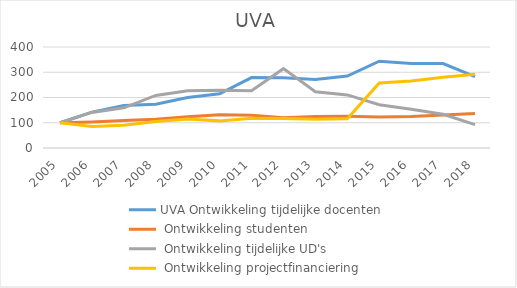
| Category | UVA Ontwikkeling tijdelijke docenten | UVA Ontwikkeling studenten | UVA Ontwikkeling tijdelijke UD's | UVA Ontwikkeling projectfinanciering |
|---|---|---|---|---|
| 2005.0 | 100 | 100 | 100 | 100 |
| 2006.0 | 142.105 | 103.16 | 140.816 | 85.627 |
| 2007.0 | 168.421 | 108.665 | 159.184 | 90.049 |
| 2008.0 | 173.684 | 113.745 | 208.163 | 105.143 |
| 2009.0 | 200 | 123.912 | 226.531 | 114.899 |
| 2010.0 | 214.912 | 131.898 | 228.571 | 107.439 |
| 2011.0 | 278.947 | 129.224 | 226.531 | 117.684 |
| 2012.0 | 278.07 | 119.647 | 314.286 | 116.339 |
| 2013.0 | 271.053 | 125.112 | 222.449 | 113.759 |
| 2014.0 | 285.088 | 125.377 | 210.204 | 115.725 |
| 2015.0 | 343.86 | 122.944 | 171.429 | 257.617 |
| 2016.0 | 335.088 | 124.57 | 153.061 | 264.988 |
| 2017.0 | 334.316 | 131.015 | 133.347 | 280.098 |
| 2018.0 | 282.947 | 136.793 | 92.571 | 292.015 |